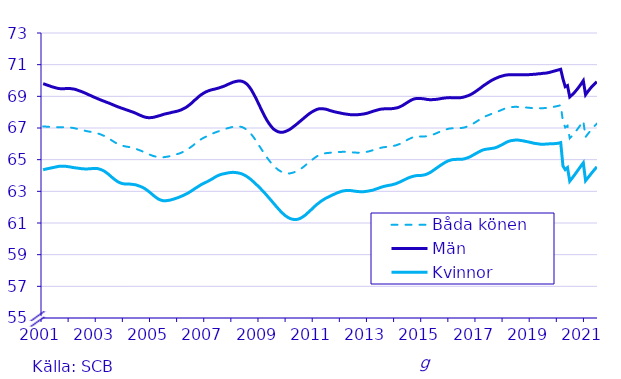
| Category | Båda könen | Män | Kvinnor |
|---|---|---|---|
| 2001.0 | 67.1 | 69.8 | 64.36 |
| nan | 67.09 | 69.75 | 64.4 |
| nan | 67.08 | 69.7 | 64.43 |
| nan | 67.07 | 69.65 | 64.46 |
| nan | 67.06 | 69.6 | 64.49 |
| nan | 67.06 | 69.56 | 64.52 |
| nan | 67.05 | 69.52 | 64.55 |
| nan | 67.05 | 69.49 | 64.58 |
| nan | 67.05 | 69.48 | 64.59 |
| nan | 67.05 | 69.48 | 64.59 |
| nan | 67.05 | 69.49 | 64.58 |
| nan | 67.05 | 69.49 | 64.56 |
| nan | 67.03 | 69.49 | 64.54 |
| nan | 67.01 | 69.47 | 64.51 |
| nan | 66.98 | 69.45 | 64.49 |
| nan | 66.95 | 69.4 | 64.47 |
| nan | 66.92 | 69.35 | 64.45 |
| nan | 66.88 | 69.3 | 64.43 |
| nan | 66.85 | 69.24 | 64.42 |
| nan | 66.81 | 69.18 | 64.41 |
| nan | 66.78 | 69.11 | 64.42 |
| nan | 66.76 | 69.05 | 64.43 |
| nan | 66.73 | 68.98 | 64.44 |
| nan | 66.7 | 68.92 | 64.45 |
| 2003.0 | 66.66 | 68.86 | 64.44 |
| nan | 66.62 | 68.8 | 64.4 |
| nan | 66.56 | 68.74 | 64.35 |
| nan | 66.5 | 68.69 | 64.28 |
| nan | 66.42 | 68.63 | 64.18 |
| nan | 66.34 | 68.58 | 64.07 |
| nan | 66.25 | 68.52 | 63.94 |
| nan | 66.16 | 68.46 | 63.82 |
| nan | 66.07 | 68.4 | 63.71 |
| nan | 65.99 | 68.34 | 63.61 |
| nan | 65.93 | 68.29 | 63.54 |
| nan | 65.88 | 68.24 | 63.49 |
| nan | 65.85 | 68.19 | 63.47 |
| nan | 65.82 | 68.14 | 63.46 |
| nan | 65.8 | 68.09 | 63.46 |
| nan | 65.77 | 68.04 | 63.45 |
| nan | 65.73 | 67.99 | 63.43 |
| nan | 65.69 | 67.93 | 63.41 |
| nan | 65.63 | 67.86 | 63.36 |
| nan | 65.58 | 67.8 | 63.31 |
| nan | 65.52 | 67.74 | 63.25 |
| nan | 65.45 | 67.69 | 63.17 |
| nan | 65.39 | 67.66 | 63.07 |
| nan | 65.33 | 67.65 | 62.96 |
| 2005.0 | 65.27 | 67.66 | 62.84 |
| nan | 65.22 | 67.68 | 62.72 |
| nan | 65.19 | 67.72 | 62.61 |
| nan | 65.16 | 67.76 | 62.51 |
| nan | 65.15 | 67.8 | 62.45 |
| nan | 65.15 | 67.85 | 62.41 |
| nan | 65.17 | 67.89 | 62.4 |
| nan | 65.19 | 67.92 | 62.42 |
| nan | 65.22 | 67.95 | 62.44 |
| nan | 65.26 | 67.99 | 62.48 |
| nan | 65.29 | 68.02 | 62.52 |
| nan | 65.34 | 68.05 | 62.57 |
| nan | 65.38 | 68.09 | 62.62 |
| nan | 65.43 | 68.14 | 62.68 |
| nan | 65.5 | 68.21 | 62.74 |
| nan | 65.57 | 68.28 | 62.81 |
| nan | 65.66 | 68.38 | 62.88 |
| nan | 65.76 | 68.49 | 62.97 |
| nan | 65.86 | 68.61 | 63.06 |
| nan | 65.98 | 68.75 | 63.16 |
| nan | 66.09 | 68.87 | 63.25 |
| nan | 66.2 | 69 | 63.34 |
| nan | 66.3 | 69.11 | 63.43 |
| nan | 66.38 | 69.2 | 63.5 |
| 2007.0 | 66.45 | 69.28 | 63.57 |
| nan | 66.52 | 69.34 | 63.64 |
| nan | 66.58 | 69.39 | 63.72 |
| nan | 66.65 | 69.43 | 63.8 |
| nan | 66.71 | 69.46 | 63.89 |
| nan | 66.76 | 69.5 | 63.97 |
| nan | 66.81 | 69.54 | 64.03 |
| nan | 66.86 | 69.59 | 64.08 |
| nan | 66.91 | 69.64 | 64.11 |
| nan | 66.96 | 69.7 | 64.14 |
| nan | 67 | 69.77 | 64.17 |
| nan | 67.04 | 69.83 | 64.19 |
| nan | 67.07 | 69.89 | 64.2 |
| nan | 67.09 | 69.93 | 64.19 |
| nan | 67.1 | 69.96 | 64.17 |
| nan | 67.09 | 69.97 | 64.14 |
| nan | 67.06 | 69.95 | 64.1 |
| nan | 66.99 | 69.89 | 64.03 |
| nan | 66.9 | 69.79 | 63.95 |
| nan | 66.78 | 69.64 | 63.85 |
| nan | 66.62 | 69.44 | 63.74 |
| nan | 66.44 | 69.19 | 63.61 |
| nan | 66.23 | 68.92 | 63.48 |
| nan | 66.01 | 68.63 | 63.34 |
| 2009.0 | 65.79 | 68.33 | 63.2 |
| nan | 65.57 | 68.03 | 63.05 |
| nan | 65.35 | 67.75 | 62.9 |
| nan | 65.14 | 67.49 | 62.74 |
| nan | 64.95 | 67.27 | 62.57 |
| nan | 64.77 | 67.08 | 62.41 |
| nan | 64.61 | 66.93 | 62.24 |
| nan | 64.48 | 66.83 | 62.07 |
| nan | 64.36 | 66.76 | 61.91 |
| nan | 64.27 | 66.73 | 61.75 |
| nan | 64.2 | 66.73 | 61.61 |
| nan | 64.16 | 66.77 | 61.48 |
| nan | 64.13 | 66.83 | 61.38 |
| nan | 64.13 | 66.9 | 61.3 |
| nan | 64.16 | 67 | 61.25 |
| nan | 64.2 | 67.11 | 61.22 |
| nan | 64.26 | 67.22 | 61.22 |
| nan | 64.33 | 67.34 | 61.25 |
| nan | 64.42 | 67.46 | 61.31 |
| nan | 64.52 | 67.58 | 61.4 |
| nan | 64.64 | 67.7 | 61.5 |
| nan | 64.76 | 67.82 | 61.63 |
| nan | 64.88 | 67.93 | 61.76 |
| nan | 64.99 | 68.02 | 61.89 |
| 2011.0 | 65.1 | 68.1 | 62.03 |
| nan | 65.2 | 68.17 | 62.16 |
| nan | 65.27 | 68.21 | 62.27 |
| nan | 65.34 | 68.22 | 62.38 |
| nan | 65.38 | 68.21 | 62.47 |
| nan | 65.41 | 68.19 | 62.56 |
| nan | 65.42 | 68.15 | 62.63 |
| nan | 65.44 | 68.1 | 62.7 |
| nan | 65.45 | 68.06 | 62.77 |
| nan | 65.46 | 68.02 | 62.83 |
| nan | 65.47 | 67.99 | 62.9 |
| nan | 65.49 | 67.96 | 62.95 |
| nan | 65.49 | 67.93 | 63 |
| nan | 65.5 | 67.9 | 63.03 |
| nan | 65.49 | 67.88 | 63.05 |
| nan | 65.49 | 67.86 | 63.05 |
| nan | 65.47 | 67.84 | 63.05 |
| nan | 65.46 | 67.83 | 63.03 |
| nan | 65.45 | 67.83 | 63.01 |
| nan | 65.44 | 67.84 | 62.99 |
| nan | 65.44 | 67.85 | 62.98 |
| nan | 65.45 | 67.87 | 62.98 |
| nan | 65.47 | 67.89 | 62.98 |
| nan | 65.49 | 67.92 | 63 |
| 2013.0 | 65.52 | 67.96 | 63.02 |
| nan | 65.56 | 68.01 | 63.05 |
| nan | 65.6 | 68.06 | 63.08 |
| nan | 65.65 | 68.1 | 63.13 |
| nan | 65.69 | 68.14 | 63.18 |
| nan | 65.73 | 68.18 | 63.23 |
| nan | 65.77 | 68.2 | 63.28 |
| nan | 65.79 | 68.21 | 63.32 |
| nan | 65.81 | 68.22 | 63.35 |
| nan | 65.83 | 68.22 | 63.38 |
| nan | 65.84 | 68.22 | 63.4 |
| nan | 65.87 | 68.23 | 63.44 |
| nan | 65.9 | 68.26 | 63.48 |
| nan | 65.95 | 68.29 | 63.54 |
| nan | 66 | 68.35 | 63.6 |
| nan | 66.08 | 68.42 | 63.67 |
| nan | 66.16 | 68.51 | 63.74 |
| nan | 66.24 | 68.6 | 63.81 |
| nan | 66.31 | 68.69 | 63.87 |
| nan | 66.38 | 68.77 | 63.92 |
| nan | 66.43 | 68.83 | 63.96 |
| nan | 66.45 | 68.86 | 63.99 |
| nan | 66.46 | 68.87 | 64 |
| nan | 66.47 | 68.86 | 64 |
| 2015.0 | 66.46 | 68.85 | 64.02 |
| nan | 66.47 | 68.83 | 64.05 |
| nan | 66.48 | 68.8 | 64.1 |
| nan | 66.51 | 68.79 | 64.17 |
| nan | 66.56 | 68.79 | 64.26 |
| nan | 66.61 | 68.8 | 64.36 |
| nan | 66.67 | 68.81 | 64.46 |
| nan | 66.73 | 68.83 | 64.56 |
| nan | 66.79 | 68.86 | 64.66 |
| nan | 66.85 | 68.88 | 64.75 |
| nan | 66.9 | 68.9 | 64.84 |
| nan | 66.94 | 68.91 | 64.91 |
| nan | 66.97 | 68.92 | 64.96 |
| nan | 66.98 | 68.91 | 65 |
| nan | 66.99 | 68.91 | 65.01 |
| nan | 66.99 | 68.91 | 65.02 |
| nan | 66.99 | 68.91 | 65.02 |
| nan | 67 | 68.92 | 65.02 |
| nan | 67.02 | 68.95 | 65.04 |
| nan | 67.06 | 68.99 | 65.08 |
| nan | 67.11 | 69.04 | 65.13 |
| nan | 67.18 | 69.1 | 65.19 |
| nan | 67.25 | 69.18 | 65.27 |
| nan | 67.34 | 69.27 | 65.35 |
| 2017.0 | 67.43 | 69.37 | 65.43 |
| nan | 67.52 | 69.47 | 65.51 |
| nan | 67.61 | 69.58 | 65.58 |
| nan | 67.69 | 69.69 | 65.63 |
| nan | 67.76 | 69.78 | 65.66 |
| nan | 67.81 | 69.88 | 65.68 |
| nan | 67.87 | 69.97 | 65.7 |
| nan | 67.92 | 70.05 | 65.72 |
| nan | 67.97 | 70.12 | 65.75 |
| nan | 68.03 | 70.18 | 65.8 |
| nan | 68.09 | 70.24 | 65.87 |
| nan | 68.15 | 70.28 | 65.94 |
| nan | 68.21 | 70.32 | 66.02 |
| nan | 68.26 | 70.35 | 66.1 |
| nan | 68.29 | 70.36 | 66.16 |
| nan | 68.32 | 70.37 | 66.2 |
| nan | 68.33 | 70.37 | 66.22 |
| nan | 68.34 | 70.37 | 66.24 |
| nan | 68.33 | 70.36 | 66.24 |
| nan | 68.33 | 70.36 | 66.22 |
| nan | 68.31 | 70.36 | 66.2 |
| nan | 68.3 | 70.36 | 66.17 |
| nan | 68.29 | 70.37 | 66.14 |
| nan | 68.28 | 70.37 | 66.11 |
| 2019.0 | 68.26 | 70.38 | 66.08 |
| nan | 68.26 | 70.39 | 66.04 |
| nan | 68.25 | 70.4 | 66.02 |
| nan | 68.25 | 70.42 | 66 |
| nan | 68.25 | 70.43 | 65.98 |
| nan | 68.25 | 70.45 | 65.97 |
| nan | 68.26 | 70.46 | 65.98 |
| nan | 68.27 | 70.48 | 65.99 |
| nan | 68.29 | 70.51 | 66 |
| nan | 68.32 | 70.55 | 66 |
| nan | 68.34 | 70.59 | 66.01 |
| nan | 68.37 | 70.63 | 66.02 |
| nan | 68.4 | 70.67 | 66.04 |
| nan | 68.44 | 70.71 | 66.08 |
| nan | 67.4 | 70.1 | 64.6 |
| nan | 67.03 | 69.61 | 64.37 |
| nan | 67.14 | 69.68 | 64.5 |
| nan | 66.35 | 68.96 | 63.64 |
| nan | 66.5 | 69.09 | 63.82 |
| nan | 66.67 | 69.23 | 64.01 |
| nan | 66.85 | 69.4 | 64.21 |
| nan | 67.04 | 69.58 | 64.41 |
| nan | 67.24 | 69.78 | 64.61 |
| nan | 67.44 | 69.99 | 64.8 |
| 2021.0 | 66.43 | 69.1 | 63.67 |
| nan | 66.62 | 69.3 | 63.85 |
| nan | 66.8 | 69.48 | 64.03 |
| nan | 66.97 | 69.65 | 64.21 |
| nan | 67.13 | 69.79 | 64.38 |
| nan | 67.28 | 69.92 | 64.55 |